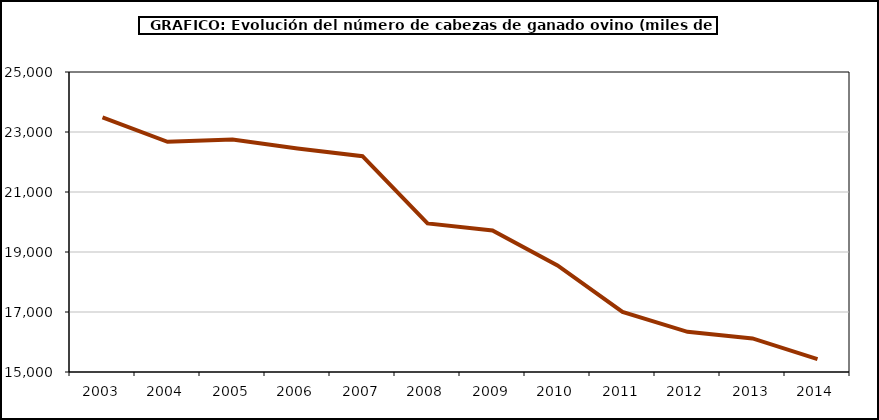
| Category | Total Ovino |
|---|---|
| 2003.0 | 23485.948 |
| 2004.0 | 22672.018 |
| 2005.0 | 22749 |
| 2006.0 | 22451.627 |
| 2007.0 | 22194.257 |
| 2008.0 | 19952.282 |
| 2009.0 | 19718.195 |
| 2010.0 | 18552 |
| 2011.0 | 17003 |
| 2012.0 | 16339.373 |
| 2013.0 | 16118.586 |
| 2014.0 | 15431.804 |